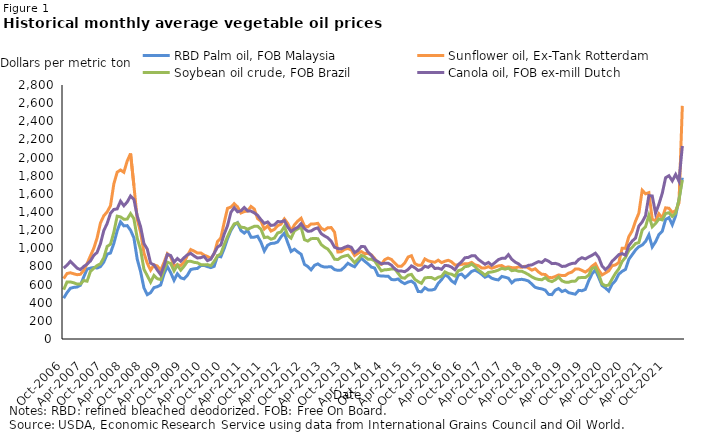
| Category | RBD Palm oil, FOB Malaysia | Sunflower oil, Ex-Tank Rotterdam | Soybean oil crude, FOB Brazil | Canola oil, FOB ex-mill Dutch |
|---|---|---|---|---|
| 2006-10-01 | 450 | 666 | 544 | 781 |
| 2006-11-01 | 511 | 722 | 629 | 814 |
| 2006-12-01 | 559 | 730 | 629 | 856 |
| 2007-01-01 | 569 | 719 | 620 | 818 |
| 2007-02-01 | 573 | 709 | 605 | 781 |
| 2007-03-01 | 593 | 713 | 605 | 765 |
| 2007-04-01 | 684 | 755 | 645 | 799 |
| 2007-05-01 | 770 | 831 | 637 | 825 |
| 2007-06-01 | 781 | 916 | 745 | 860 |
| 2007-07-01 | 789 | 999 | 780 | 921 |
| 2007-08-01 | 782 | 1114 | 810 | 955 |
| 2007-09-01 | 798 | 1279 | 829 | 1051 |
| 2007-10-01 | 848 | 1358 | 896 | 1195 |
| 2007-11-01 | 935 | 1401 | 1020 | 1273 |
| 2007-12-01 | 948 | 1469 | 1045 | 1386 |
| 2008-01-01 | 1053 | 1709 | 1177 | 1428 |
| 2008-02-01 | 1192 | 1839 | 1354 | 1434 |
| 2008-03-01 | 1291 | 1863 | 1346 | 1519 |
| 2008-04-01 | 1247 | 1838 | 1320 | 1469 |
| 2008-05-01 | 1250 | 1962 | 1322 | 1510 |
| 2008-06-01 | 1199 | 2045 | 1382 | 1577 |
| 2008-07-01 | 1115 | 1692 | 1326 | 1540 |
| 2008-08-01 | 879 | 1319 | 1110 | 1355 |
| 2008-09-01 | 743 | 1176 | 987 | 1238 |
| 2008-10-01 | 564 | 950 | 769 | 1053 |
| 2008-11-01 | 489 | 835 | 698 | 991 |
| 2008-12-01 | 511 | 759 | 627 | 836 |
| 2009-01-01 | 566 | 817 | 700 | 817 |
| 2009-02-01 | 577 | 805 | 665 | 760 |
| 2009-03-01 | 595 | 757 | 655 | 709 |
| 2009-04-01 | 716 | 843 | 762 | 807 |
| 2009-05-01 | 799 | 941 | 847 | 933 |
| 2009-06-01 | 732 | 907 | 832 | 920 |
| 2009-07-01 | 647 | 804 | 751 | 846 |
| 2009-08-01 | 719 | 820 | 814 | 887 |
| 2009-09-01 | 675 | 809 | 759 | 857 |
| 2009-10-01 | 663 | 846 | 802 | 896 |
| 2009-11-01 | 703 | 921 | 855 | 928 |
| 2009-12-01 | 766 | 986 | 857 | 944 |
| 2010-01-01 | 774 | 969 | 845 | 916 |
| 2010-02-01 | 778 | 948 | 840 | 893 |
| 2010-03-01 | 809 | 949 | 820 | 897 |
| 2010-04-01 | 811 | 924 | 817 | 909 |
| 2010-05-01 | 798 | 910 | 820 | 864 |
| 2010-06-01 | 787 | 889 | 808 | 880 |
| 2010-07-01 | 801 | 937 | 856 | 946 |
| 2010-08-01 | 915 | 1074 | 915 | 1013 |
| 2010-09-01 | 906 | 1114 | 940 | 1037 |
| 2010-10-01 | 997 | 1284 | 1040 | 1156 |
| 2010-11-01 | 1107 | 1441 | 1130 | 1249 |
| 2010-12-01 | 1196 | 1454 | 1208 | 1396 |
| 2011-01-01 | 1256 | 1492 | 1269 | 1447 |
| 2011-02-01 | 1282 | 1456 | 1280 | 1402 |
| 2011-03-01 | 1196 | 1389 | 1232 | 1414 |
| 2011-04-01 | 1167 | 1405 | 1229 | 1450 |
| 2011-05-01 | 1199 | 1411 | 1210 | 1412 |
| 2011-06-01 | 1123 | 1461 | 1226 | 1410 |
| 2011-07-01 | 1123 | 1433 | 1242 | 1391 |
| 2011-08-01 | 1133 | 1327 | 1243 | 1363 |
| 2011-09-01 | 1066 | 1299 | 1210 | 1315 |
| 2011-10-01 | 970 | 1212 | 1118 | 1275 |
| 2011-11-01 | 1034 | 1248 | 1124 | 1290 |
| 2011-12-01 | 1053 | 1190 | 1100 | 1252 |
| 2012-01-01 | 1056 | 1208 | 1112 | 1257 |
| 2012-02-01 | 1070 | 1249 | 1169 | 1295 |
| 2012-03-01 | 1126 | 1266 | 1180 | 1292 |
| 2012-04-01 | 1166 | 1324 | 1241 | 1305 |
| 2012-05-01 | 1062 | 1275 | 1142 | 1235 |
| 2012-06-01 | 965 | 1192 | 1112 | 1185 |
| 2012-07-01 | 990 | 1258 | 1192 | 1212 |
| 2012-08-01 | 960 | 1300 | 1214 | 1232 |
| 2012-09-01 | 935 | 1331 | 1234 | 1271 |
| 2012-10-01 | 823 | 1245 | 1095 | 1217 |
| 2012-11-01 | 799 | 1237 | 1080 | 1188 |
| 2012-12-01 | 763 | 1269 | 1106 | 1190 |
| 2013-01-01 | 812 | 1269 | 1108 | 1214 |
| 2013-02-01 | 828 | 1275 | 1106 | 1225 |
| 2013-03-01 | 804 | 1221 | 1042 | 1162 |
| 2013-04-01 | 793 | 1201 | 1012 | 1136 |
| 2013-05-01 | 795 | 1227 | 991 | 1116 |
| 2013-06-01 | 796 | 1228 | 942 | 1078 |
| 2013-07-01 | 765 | 1178 | 880 | 1012 |
| 2013-08-01 | 757 | 959 | 876 | 997 |
| 2013-09-01 | 760 | 962 | 902 | 994 |
| 2013-10-01 | 795 | 988 | 915 | 1011 |
| 2013-11-01 | 835 | 998 | 924 | 1025 |
| 2013-12-01 | 813 | 982 | 884 | 1012 |
| 2014-01-01 | 796 | 920 | 841 | 952 |
| 2014-02-01 | 846 | 945 | 878 | 976 |
| 2014-03-01 | 890 | 964 | 922 | 1019 |
| 2014-04-01 | 858 | 941 | 909 | 1018 |
| 2014-05-01 | 828 | 943 | 880 | 958 |
| 2014-06-01 | 793 | 928 | 880 | 922 |
| 2014-07-01 | 782 | 887 | 861 | 875 |
| 2014-08-01 | 701 | 828 | 804 | 853 |
| 2014-09-01 | 694 | 823 | 751 | 828 |
| 2014-10-01 | 693 | 874 | 764 | 836 |
| 2014-11-01 | 693 | 892 | 765 | 836 |
| 2014-12-01 | 656 | 877 | 772 | 814 |
| 2015-01-01 | 652 | 837 | 773 | 773 |
| 2015-02-01 | 662 | 802 | 725 | 751 |
| 2015-03-01 | 629 | 801 | 676 | 749 |
| 2015-04-01 | 610 | 838 | 670 | 742 |
| 2015-05-01 | 628 | 904 | 704 | 766 |
| 2015-06-01 | 638 | 918 | 712 | 806 |
| 2015-07-01 | 610 | 832 | 658 | 786 |
| 2015-08-01 | 524 | 812 | 633 | 755 |
| 2015-09-01 | 521 | 815 | 614 | 766 |
| 2015-10-01 | 565 | 883 | 673 | 802 |
| 2015-11-01 | 541 | 862 | 678 | 790 |
| 2015-12-01 | 539 | 852 | 677 | 818 |
| 2016-01-01 | 550 | 846 | 658 | 777 |
| 2016-02-01 | 613 | 869 | 680 | 781 |
| 2016-03-01 | 654 | 842 | 691 | 768 |
| 2016-04-01 | 707 | 857 | 740 | 811 |
| 2016-05-01 | 686 | 868 | 721 | 808 |
| 2016-06-01 | 640 | 851 | 714 | 792 |
| 2016-07-01 | 615 | 816 | 694 | 763 |
| 2016-08-01 | 704 | 815 | 753 | 819 |
| 2016-09-01 | 716 | 823 | 764 | 852 |
| 2016-10-01 | 677 | 830 | 797 | 896 |
| 2016-11-01 | 708 | 830 | 803 | 899 |
| 2016-12-01 | 745 | 844 | 826 | 918 |
| 2017-01-01 | 759 | 817 | 798 | 917 |
| 2017-02-01 | 740 | 808 | 761 | 878 |
| 2017-03-01 | 713 | 783 | 734 | 850 |
| 2017-04-01 | 681 | 784 | 704 | 824 |
| 2017-05-01 | 698 | 797 | 734 | 844 |
| 2017-06-01 | 670 | 780 | 739 | 813 |
| 2017-07-01 | 658 | 793 | 747 | 843 |
| 2017-08-01 | 651 | 806 | 760 | 875 |
| 2017-09-01 | 690 | 810 | 779 | 889 |
| 2017-10-01 | 681 | 788 | 770 | 889 |
| 2017-11-01 | 670 | 795 | 781 | 930 |
| 2017-12-01 | 619 | 787 | 753 | 879 |
| 2018-01-01 | 650 | 784 | 759 | 848 |
| 2018-02-01 | 654 | 794 | 748 | 829 |
| 2018-03-01 | 658 | 790 | 747 | 798 |
| 2018-04-01 | 651 | 802 | 730 | 794 |
| 2018-05-01 | 639 | 782 | 710 | 812 |
| 2018-06-01 | 605 | 759 | 685 | 817 |
| 2018-07-01 | 570 | 774 | 666 | 836 |
| 2018-08-01 | 559 | 739 | 657 | 853 |
| 2018-09-01 | 552 | 713 | 653 | 843 |
| 2018-10-01 | 539 | 712 | 676 | 875 |
| 2018-11-01 | 492 | 678 | 645 | 858 |
| 2018-12-01 | 489 | 676 | 633 | 831 |
| 2019-01-01 | 538 | 689 | 652 | 834 |
| 2019-02-01 | 556 | 706 | 683 | 823 |
| 2019-03-01 | 523 | 700 | 641 | 800 |
| 2019-04-01 | 538 | 701 | 627 | 802 |
| 2019-05-01 | 511 | 726 | 626 | 820 |
| 2019-06-01 | 502 | 738 | 637 | 833 |
| 2019-07-01 | 494 | 772 | 638 | 836 |
| 2019-08-01 | 536 | 772 | 676 | 877 |
| 2019-09-01 | 532 | 756 | 677 | 896 |
| 2019-10-01 | 547 | 738 | 677 | 883 |
| 2019-11-01 | 641 | 763 | 704 | 904 |
| 2019-12-01 | 718 | 802 | 778 | 923 |
| 2020-01-01 | 761 | 830 | 790 | 946 |
| 2020-02-01 | 677 | 759 | 712 | 899 |
| 2020-03-01 | 589 | 706 | 608 | 804 |
| 2020-04-01 | 563 | 728 | 587 | 765 |
| 2020-05-01 | 529 | 751 | 595 | 798 |
| 2020-06-01 | 605 | 807 | 661 | 857 |
| 2020-07-01 | 643 | 817 | 724 | 893 |
| 2020-08-01 | 715 | 842 | 773 | 930 |
| 2020-09-01 | 746 | 1000 | 855 | 941 |
| 2020-10-01 | 767 | 999 | 899 | 924 |
| 2020-11-01 | 878 | 1129 | 977 | 1030 |
| 2020-12-01 | 929 | 1191 | 1010 | 1079 |
| 2021-01-01 | 980 | 1299 | 1052 | 1112 |
| 2021-02-01 | 1017 | 1387 | 1063 | 1245 |
| 2021-03-01 | 1036 | 1640 | 1201 | 1290 |
| 2021-04-01 | 1075 | 1601 | 1238 | 1359 |
| 2021-05-01 | 1149 | 1613 | 1364 | 1580 |
| 2021-06-01 | 1015 | 1320 | 1237 | 1577 |
| 2021-07-01 | 1072 | 1305 | 1273 | 1386 |
| 2021-08-01 | 1151 | 1380 | 1323 | 1486 |
| 2021-09-01 | 1187 | 1333 | 1313 | 1606 |
| 2021-10-01 | 1318 | 1446 | 1383 | 1778 |
| 2021-11-01 | 1338 | 1441 | 1392 | 1800 |
| 2021-12-01 | 1259 | 1396 | 1351 | 1743 |
| 2022-01-01 | 1358 | 1413 | 1389 | 1814 |
| 2022-02-01 | 1540 | 1500 | 1533 | 1739 |
| 2022-03-01 | 1778 | 2570 | 1752 | 2128 |